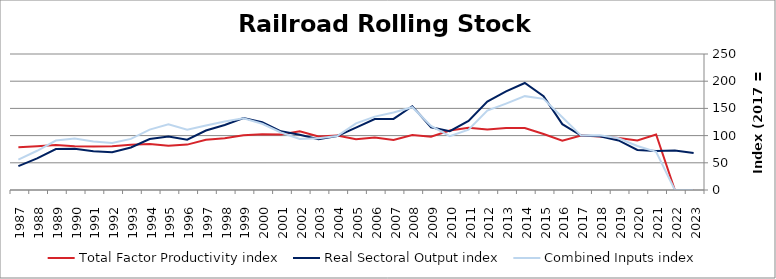
| Category | Total Factor Productivity index | Real Sectoral Output index | Combined Inputs index |
|---|---|---|---|
| 2023.0 | 0 | 68.085 | 0 |
| 2022.0 | 0 | 72.651 | 0 |
| 2021.0 | 102.027 | 71.688 | 70.264 |
| 2020.0 | 91.124 | 73.72 | 80.901 |
| 2019.0 | 95.733 | 91.028 | 95.085 |
| 2018.0 | 98.405 | 98.951 | 100.555 |
| 2017.0 | 100 | 100 | 100 |
| 2016.0 | 90.541 | 121.065 | 133.713 |
| 2015.0 | 102.954 | 172.502 | 167.553 |
| 2014.0 | 114.027 | 196.723 | 172.523 |
| 2013.0 | 114.033 | 181.192 | 158.894 |
| 2012.0 | 111.357 | 162.608 | 146.024 |
| 2011.0 | 114.518 | 127.057 | 110.949 |
| 2010.0 | 109.316 | 108.179 | 98.96 |
| 2009.0 | 97.971 | 115.332 | 117.721 |
| 2008.0 | 101.19 | 154.027 | 152.215 |
| 2007.0 | 91.754 | 130.678 | 142.421 |
| 2006.0 | 96.713 | 130.494 | 134.928 |
| 2005.0 | 93.503 | 114.528 | 122.487 |
| 2004.0 | 100.091 | 99.396 | 99.306 |
| 2003.0 | 98.278 | 93.413 | 95.05 |
| 2002.0 | 108.11 | 101.522 | 93.906 |
| 2001.0 | 102.028 | 107.91 | 105.765 |
| 2000.0 | 102.471 | 124.716 | 121.709 |
| 1999.0 | 100.451 | 132.307 | 131.713 |
| 1998.0 | 95.069 | 119.577 | 125.779 |
| 1997.0 | 92.325 | 109.345 | 118.435 |
| 1996.0 | 83.447 | 92.471 | 110.814 |
| 1995.0 | 81.369 | 98.162 | 120.637 |
| 1994.0 | 84.38 | 93.683 | 111.025 |
| 1993.0 | 83.154 | 78.137 | 93.966 |
| 1992.0 | 80.419 | 69.449 | 86.359 |
| 1991.0 | 80.153 | 71.311 | 88.968 |
| 1990.0 | 80.332 | 76.004 | 94.613 |
| 1989.0 | 82.738 | 75.238 | 90.935 |
| 1988.0 | 80.447 | 58.002 | 72.099 |
| 1987.0 | 78.745 | 43.887 | 55.732 |